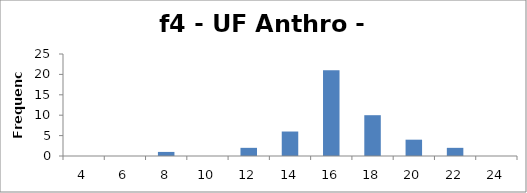
| Category | Frequency |
|---|---|
| 4.0 | 0 |
| 6.0 | 0 |
| 8.0 | 1 |
| 10.0 | 0 |
| 12.0 | 2 |
| 14.0 | 6 |
| 16.0 | 21 |
| 18.0 | 10 |
| 20.0 | 4 |
| 22.0 | 2 |
| 24.0 | 0 |